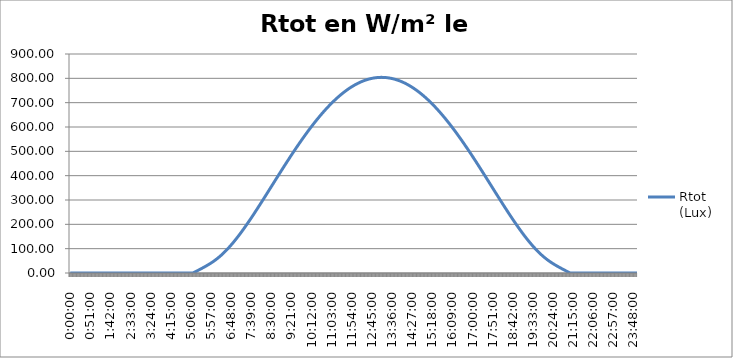
| Category | Rtot
(Lux) |
|---|---|
| 0.0 | 0 |
| 0.0006944444444444445 | 0 |
| 0.001388888888888889 | 0 |
| 0.0020833333333333333 | 0 |
| 0.002777777777777778 | 0 |
| 0.0034722222222222225 | 0 |
| 0.004166666666666667 | 0 |
| 0.004861111111111111 | 0 |
| 0.005555555555555556 | 0 |
| 0.00625 | 0 |
| 0.006944444444444445 | 0 |
| 0.0076388888888888895 | 0 |
| 0.008333333333333333 | 0 |
| 0.009027777777777777 | 0 |
| 0.00972222222222222 | 0 |
| 0.010416666666666664 | 0 |
| 0.011111111111111108 | 0 |
| 0.011805555555555552 | 0 |
| 0.012499999999999995 | 0 |
| 0.01319444444444444 | 0 |
| 0.013888888888888883 | 0 |
| 0.014583333333333327 | 0 |
| 0.01527777777777777 | 0 |
| 0.015972222222222214 | 0 |
| 0.01666666666666666 | 0 |
| 0.017361111111111105 | 0 |
| 0.01805555555555555 | 0 |
| 0.018749999999999996 | 0 |
| 0.01944444444444444 | 0 |
| 0.020138888888888887 | 0 |
| 0.020833333333333332 | 0 |
| 0.021527777777777778 | 0 |
| 0.022222222222222223 | 0 |
| 0.02291666666666667 | 0 |
| 0.023611111111111114 | 0 |
| 0.02430555555555556 | 0 |
| 0.025000000000000005 | 0 |
| 0.02569444444444445 | 0 |
| 0.026388888888888896 | 0 |
| 0.02708333333333334 | 0 |
| 0.027777777777777787 | 0 |
| 0.028472222222222232 | 0 |
| 0.029166666666666678 | 0 |
| 0.029861111111111123 | 0 |
| 0.03055555555555557 | 0 |
| 0.031250000000000014 | 0 |
| 0.031944444444444456 | 0 |
| 0.0326388888888889 | 0 |
| 0.03333333333333334 | 0 |
| 0.03402777777777778 | 0 |
| 0.034722222222222224 | 0 |
| 0.035416666666666666 | 0 |
| 0.03611111111111111 | 0 |
| 0.03680555555555555 | 0 |
| 0.03749999999999999 | 0 |
| 0.038194444444444434 | 0 |
| 0.038888888888888876 | 0 |
| 0.03958333333333332 | 0 |
| 0.04027777777777776 | 0 |
| 0.0409722222222222 | 0 |
| 0.041666666666666644 | 0 |
| 0.042361111111111086 | 0 |
| 0.04305555555555553 | 0 |
| 0.04374999999999997 | 0 |
| 0.04444444444444441 | 0 |
| 0.04513888888888885 | 0 |
| 0.045833333333333295 | 0 |
| 0.04652777777777774 | 0 |
| 0.04722222222222218 | 0 |
| 0.04791666666666662 | 0 |
| 0.04861111111111106 | 0 |
| 0.049305555555555505 | 0 |
| 0.04999999999999995 | 0 |
| 0.05069444444444439 | 0 |
| 0.05138888888888883 | 0 |
| 0.05208333333333327 | 0 |
| 0.052777777777777715 | 0 |
| 0.05347222222222216 | 0 |
| 0.0541666666666666 | 0 |
| 0.05486111111111104 | 0 |
| 0.05555555555555548 | 0 |
| 0.056249999999999925 | 0 |
| 0.05694444444444437 | 0 |
| 0.05763888888888881 | 0 |
| 0.05833333333333325 | 0 |
| 0.05902777777777769 | 0 |
| 0.059722222222222135 | 0 |
| 0.06041666666666658 | 0 |
| 0.06111111111111102 | 0 |
| 0.06180555555555546 | 0 |
| 0.0624999999999999 | 0 |
| 0.06319444444444434 | 0 |
| 0.06388888888888879 | 0 |
| 0.06458333333333323 | 0 |
| 0.06527777777777767 | 0 |
| 0.06597222222222211 | 0 |
| 0.06666666666666655 | 0 |
| 0.067361111111111 | 0 |
| 0.06805555555555544 | 0 |
| 0.06874999999999988 | 0 |
| 0.06944444444444432 | 0 |
| 0.07013888888888876 | 0 |
| 0.0708333333333332 | 0 |
| 0.07152777777777765 | 0 |
| 0.07222222222222209 | 0 |
| 0.07291666666666653 | 0 |
| 0.07361111111111097 | 0 |
| 0.07430555555555542 | 0 |
| 0.07499999999999986 | 0 |
| 0.0756944444444443 | 0 |
| 0.07638888888888874 | 0 |
| 0.07708333333333318 | 0 |
| 0.07777777777777763 | 0 |
| 0.07847222222222207 | 0 |
| 0.07916666666666651 | 0 |
| 0.07986111111111095 | 0 |
| 0.0805555555555554 | 0 |
| 0.08124999999999984 | 0 |
| 0.08194444444444428 | 0 |
| 0.08263888888888872 | 0 |
| 0.08333333333333316 | 0 |
| 0.0840277777777776 | 0 |
| 0.08472222222222205 | 0 |
| 0.08541666666666649 | 0 |
| 0.08611111111111093 | 0 |
| 0.08680555555555537 | 0 |
| 0.08749999999999981 | 0 |
| 0.08819444444444426 | 0 |
| 0.0888888888888887 | 0 |
| 0.08958333333333314 | 0 |
| 0.09027777777777758 | 0 |
| 0.09097222222222202 | 0 |
| 0.09166666666666647 | 0 |
| 0.09236111111111091 | 0 |
| 0.09305555555555535 | 0 |
| 0.09374999999999979 | 0 |
| 0.09444444444444423 | 0 |
| 0.09513888888888868 | 0 |
| 0.09583333333333312 | 0 |
| 0.09652777777777756 | 0 |
| 0.097222222222222 | 0 |
| 0.09791666666666644 | 0 |
| 0.09861111111111089 | 0 |
| 0.09930555555555533 | 0 |
| 0.09999999999999977 | 0 |
| 0.10069444444444421 | 0 |
| 0.10138888888888865 | 0 |
| 0.1020833333333331 | 0 |
| 0.10277777777777754 | 0 |
| 0.10347222222222198 | 0 |
| 0.10416666666666642 | 0 |
| 0.10486111111111086 | 0 |
| 0.1055555555555553 | 0 |
| 0.10624999999999975 | 0 |
| 0.10694444444444419 | 0 |
| 0.10763888888888863 | 0 |
| 0.10833333333333307 | 0 |
| 0.10902777777777752 | 0 |
| 0.10972222222222196 | 0 |
| 0.1104166666666664 | 0 |
| 0.11111111111111084 | 0 |
| 0.11180555555555528 | 0 |
| 0.11249999999999973 | 0 |
| 0.11319444444444417 | 0 |
| 0.11388888888888861 | 0 |
| 0.11458333333333305 | 0 |
| 0.1152777777777775 | 0 |
| 0.11597222222222194 | 0 |
| 0.11666666666666638 | 0 |
| 0.11736111111111082 | 0 |
| 0.11805555555555526 | 0 |
| 0.1187499999999997 | 0 |
| 0.11944444444444414 | 0 |
| 0.12013888888888859 | 0 |
| 0.12083333333333303 | 0 |
| 0.12152777777777747 | 0 |
| 0.12222222222222191 | 0 |
| 0.12291666666666635 | 0 |
| 0.1236111111111108 | 0 |
| 0.12430555555555524 | 0 |
| 0.12499999999999968 | 0 |
| 0.12569444444444414 | 0 |
| 0.12638888888888858 | 0 |
| 0.12708333333333302 | 0 |
| 0.12777777777777746 | 0 |
| 0.1284722222222219 | 0 |
| 0.12916666666666635 | 0 |
| 0.1298611111111108 | 0 |
| 0.13055555555555523 | 0 |
| 0.13124999999999967 | 0 |
| 0.13194444444444411 | 0 |
| 0.13263888888888856 | 0 |
| 0.133333333333333 | 0 |
| 0.13402777777777744 | 0 |
| 0.13472222222222188 | 0 |
| 0.13541666666666632 | 0 |
| 0.13611111111111077 | 0 |
| 0.1368055555555552 | 0 |
| 0.13749999999999965 | 0 |
| 0.1381944444444441 | 0 |
| 0.13888888888888853 | 0 |
| 0.13958333333333298 | 0 |
| 0.14027777777777742 | 0 |
| 0.14097222222222186 | 0 |
| 0.1416666666666663 | 0 |
| 0.14236111111111074 | 0 |
| 0.14305555555555519 | 0 |
| 0.14374999999999963 | 0 |
| 0.14444444444444407 | 0 |
| 0.1451388888888885 | 0 |
| 0.14583333333333295 | 0 |
| 0.1465277777777774 | 0 |
| 0.14722222222222184 | 0 |
| 0.14791666666666628 | 0 |
| 0.14861111111111072 | 0 |
| 0.14930555555555516 | 0 |
| 0.1499999999999996 | 0 |
| 0.15069444444444405 | 0 |
| 0.1513888888888885 | 0 |
| 0.15208333333333293 | 0 |
| 0.15277777777777737 | 0 |
| 0.15347222222222182 | 0 |
| 0.15416666666666626 | 0 |
| 0.1548611111111107 | 0 |
| 0.15555555555555514 | 0 |
| 0.15624999999999958 | 0 |
| 0.15694444444444403 | 0 |
| 0.15763888888888847 | 0 |
| 0.1583333333333329 | 0 |
| 0.15902777777777735 | 0 |
| 0.1597222222222218 | 0 |
| 0.16041666666666624 | 0 |
| 0.16111111111111068 | 0 |
| 0.16180555555555512 | 0 |
| 0.16249999999999956 | 0 |
| 0.163194444444444 | 0 |
| 0.16388888888888845 | 0 |
| 0.1645833333333329 | 0 |
| 0.16527777777777733 | 0 |
| 0.16597222222222177 | 0 |
| 0.1666666666666662 | 0 |
| 0.16736111111111066 | 0 |
| 0.1680555555555551 | 0 |
| 0.16874999999999954 | 0 |
| 0.16944444444444398 | 0 |
| 0.17013888888888842 | 0 |
| 0.17083333333333287 | 0 |
| 0.1715277777777773 | 0 |
| 0.17222222222222175 | 0 |
| 0.1729166666666662 | 0 |
| 0.17361111111111063 | 0 |
| 0.17430555555555508 | 0 |
| 0.17499999999999952 | 0 |
| 0.17569444444444396 | 0 |
| 0.1763888888888884 | 0 |
| 0.17708333333333284 | 0 |
| 0.17777777777777728 | 0 |
| 0.17847222222222173 | 0 |
| 0.17916666666666617 | 0 |
| 0.1798611111111106 | 0 |
| 0.18055555555555505 | 0 |
| 0.1812499999999995 | 0 |
| 0.18194444444444394 | 0 |
| 0.18263888888888838 | 0 |
| 0.18333333333333282 | 0 |
| 0.18402777777777726 | 0 |
| 0.1847222222222217 | 0 |
| 0.18541666666666615 | 0 |
| 0.1861111111111106 | 0 |
| 0.18680555555555503 | 0 |
| 0.18749999999999947 | 0 |
| 0.18819444444444391 | 0 |
| 0.18888888888888836 | 0 |
| 0.1895833333333328 | 0 |
| 0.19027777777777724 | 0 |
| 0.19097222222222168 | 0 |
| 0.19166666666666612 | 0 |
| 0.19236111111111057 | 0 |
| 0.193055555555555 | 0 |
| 0.19374999999999945 | 0 |
| 0.1944444444444439 | 0 |
| 0.19513888888888833 | 0 |
| 0.19583333333333278 | 0 |
| 0.19652777777777722 | 0 |
| 0.19722222222222166 | 0 |
| 0.1979166666666661 | 0 |
| 0.19861111111111054 | 0 |
| 0.199305555555555 | 0 |
| 0.19999999999999943 | 0 |
| 0.20069444444444387 | 0 |
| 0.2013888888888883 | 0 |
| 0.20208333333333275 | 0 |
| 0.2027777777777772 | 0 |
| 0.20347222222222164 | 0 |
| 0.20416666666666608 | 0 |
| 0.20486111111111052 | 0 |
| 0.20555555555555496 | 0 |
| 0.2062499999999994 | 0 |
| 0.20694444444444385 | 0 |
| 0.2076388888888883 | 0 |
| 0.20833333333333273 | 0 |
| 0.20902777777777717 | 0 |
| 0.20972222222222162 | 0 |
| 0.21041666666666606 | 0 |
| 0.2111111111111105 | 0 |
| 0.21180555555555494 | 0 |
| 0.21249999999999938 | 0 |
| 0.21319444444444383 | 0 |
| 0.21388888888888827 | 0 |
| 0.2145833333333327 | 0 |
| 0.21527777777777715 | 0 |
| 0.2159722222222216 | 0 |
| 0.21666666666666604 | 0.661 |
| 0.21736111111111048 | 1.487 |
| 0.21805555555555492 | 2.316 |
| 0.21874999999999936 | 3.146 |
| 0.2194444444444438 | 3.979 |
| 0.22013888888888825 | 4.813 |
| 0.2208333333333327 | 5.65 |
| 0.22152777777777713 | 6.488 |
| 0.22222222222222157 | 7.328 |
| 0.222916666666666 | 8.171 |
| 0.22361111111111046 | 9.015 |
| 0.2243055555555549 | 9.861 |
| 0.22499999999999934 | 10.709 |
| 0.22569444444444378 | 11.559 |
| 0.22638888888888822 | 12.411 |
| 0.22708333333333267 | 13.265 |
| 0.2277777777777771 | 14.121 |
| 0.22847222222222155 | 14.979 |
| 0.229166666666666 | 15.839 |
| 0.22986111111111043 | 16.702 |
| 0.23055555555555488 | 17.567 |
| 0.23124999999999932 | 18.435 |
| 0.23194444444444376 | 19.306 |
| 0.2326388888888882 | 20.18 |
| 0.23333333333333264 | 21.058 |
| 0.23402777777777709 | 21.939 |
| 0.23472222222222153 | 22.824 |
| 0.23541666666666597 | 23.714 |
| 0.2361111111111104 | 24.608 |
| 0.23680555555555485 | 25.507 |
| 0.2374999999999993 | 26.412 |
| 0.23819444444444374 | 27.323 |
| 0.23888888888888818 | 28.24 |
| 0.23958333333333262 | 29.164 |
| 0.24027777777777706 | 30.095 |
| 0.2409722222222215 | 31.034 |
| 0.24166666666666595 | 31.981 |
| 0.2423611111111104 | 32.936 |
| 0.24305555555555483 | 33.901 |
| 0.24374999999999927 | 34.876 |
| 0.24444444444444371 | 35.86 |
| 0.24513888888888816 | 36.855 |
| 0.2458333333333326 | 37.861 |
| 0.24652777777777704 | 38.878 |
| 0.24722222222222148 | 39.907 |
| 0.24791666666666592 | 40.949 |
| 0.24861111111111037 | 42.003 |
| 0.2493055555555548 | 43.07 |
| 0.24999999999999925 | 44.15 |
| 0.2506944444444437 | 45.244 |
| 0.25138888888888816 | 46.353 |
| 0.2520833333333326 | 47.475 |
| 0.25277777777777705 | 48.612 |
| 0.2534722222222215 | 49.765 |
| 0.25416666666666593 | 50.932 |
| 0.25486111111111037 | 52.115 |
| 0.2555555555555548 | 53.314 |
| 0.25624999999999926 | 54.529 |
| 0.2569444444444437 | 55.759 |
| 0.25763888888888814 | 57.006 |
| 0.2583333333333326 | 58.27 |
| 0.259027777777777 | 59.55 |
| 0.25972222222222147 | 60.847 |
| 0.2604166666666659 | 62.161 |
| 0.26111111111111035 | 63.492 |
| 0.2618055555555548 | 64.84 |
| 0.26249999999999923 | 66.205 |
| 0.2631944444444437 | 67.587 |
| 0.2638888888888881 | 68.986 |
| 0.26458333333333256 | 70.403 |
| 0.265277777777777 | 71.837 |
| 0.26597222222222144 | 73.288 |
| 0.2666666666666659 | 74.757 |
| 0.26736111111111033 | 76.243 |
| 0.26805555555555477 | 77.746 |
| 0.2687499999999992 | 79.266 |
| 0.26944444444444365 | 80.804 |
| 0.2701388888888881 | 82.359 |
| 0.27083333333333254 | 83.931 |
| 0.271527777777777 | 85.52 |
| 0.2722222222222214 | 87.126 |
| 0.27291666666666586 | 88.749 |
| 0.2736111111111103 | 90.388 |
| 0.27430555555555475 | 92.045 |
| 0.2749999999999992 | 93.718 |
| 0.27569444444444363 | 95.407 |
| 0.2763888888888881 | 97.113 |
| 0.2770833333333325 | 98.836 |
| 0.27777777777777696 | 100.574 |
| 0.2784722222222214 | 102.329 |
| 0.27916666666666584 | 104.099 |
| 0.2798611111111103 | 105.885 |
| 0.2805555555555547 | 107.687 |
| 0.28124999999999917 | 109.505 |
| 0.2819444444444436 | 111.338 |
| 0.28263888888888805 | 113.186 |
| 0.2833333333333325 | 115.049 |
| 0.28402777777777694 | 116.927 |
| 0.2847222222222214 | 118.82 |
| 0.2854166666666658 | 120.728 |
| 0.28611111111111026 | 122.65 |
| 0.2868055555555547 | 124.587 |
| 0.28749999999999915 | 126.537 |
| 0.2881944444444436 | 128.502 |
| 0.28888888888888803 | 130.481 |
| 0.28958333333333247 | 132.473 |
| 0.2902777777777769 | 134.479 |
| 0.29097222222222136 | 136.498 |
| 0.2916666666666658 | 138.53 |
| 0.29236111111111024 | 140.576 |
| 0.2930555555555547 | 142.634 |
| 0.2937499999999991 | 144.705 |
| 0.29444444444444356 | 146.789 |
| 0.295138888888888 | 148.884 |
| 0.29583333333333245 | 150.993 |
| 0.2965277777777769 | 153.113 |
| 0.29722222222222133 | 155.245 |
| 0.2979166666666658 | 157.388 |
| 0.2986111111111102 | 159.543 |
| 0.29930555555555466 | 161.71 |
| 0.2999999999999991 | 163.888 |
| 0.30069444444444354 | 166.077 |
| 0.301388888888888 | 168.276 |
| 0.3020833333333324 | 170.486 |
| 0.30277777777777687 | 172.707 |
| 0.3034722222222213 | 174.938 |
| 0.30416666666666575 | 177.18 |
| 0.3048611111111102 | 179.431 |
| 0.30555555555555464 | 181.692 |
| 0.3062499999999991 | 183.963 |
| 0.3069444444444435 | 186.244 |
| 0.30763888888888796 | 188.533 |
| 0.3083333333333324 | 190.832 |
| 0.30902777777777685 | 193.14 |
| 0.3097222222222213 | 195.457 |
| 0.31041666666666573 | 197.783 |
| 0.3111111111111102 | 200.117 |
| 0.3118055555555546 | 202.459 |
| 0.31249999999999906 | 204.81 |
| 0.3131944444444435 | 207.169 |
| 0.31388888888888794 | 209.535 |
| 0.3145833333333324 | 211.91 |
| 0.3152777777777768 | 214.292 |
| 0.31597222222222127 | 216.681 |
| 0.3166666666666657 | 219.078 |
| 0.31736111111111015 | 221.482 |
| 0.3180555555555546 | 223.893 |
| 0.31874999999999903 | 226.31 |
| 0.3194444444444435 | 228.735 |
| 0.3201388888888879 | 231.166 |
| 0.32083333333333236 | 233.603 |
| 0.3215277777777768 | 236.046 |
| 0.32222222222222124 | 238.496 |
| 0.3229166666666657 | 240.951 |
| 0.32361111111111013 | 243.413 |
| 0.32430555555555457 | 245.88 |
| 0.324999999999999 | 248.352 |
| 0.32569444444444345 | 250.83 |
| 0.3263888888888879 | 253.313 |
| 0.32708333333333234 | 255.801 |
| 0.3277777777777768 | 258.294 |
| 0.3284722222222212 | 260.792 |
| 0.32916666666666566 | 263.294 |
| 0.3298611111111101 | 265.801 |
| 0.33055555555555455 | 268.312 |
| 0.331249999999999 | 270.828 |
| 0.33194444444444343 | 273.347 |
| 0.3326388888888879 | 275.871 |
| 0.3333333333333323 | 278.398 |
| 0.33402777777777676 | 280.93 |
| 0.3347222222222212 | 283.464 |
| 0.33541666666666564 | 286.002 |
| 0.3361111111111101 | 288.544 |
| 0.3368055555555545 | 291.088 |
| 0.33749999999999897 | 293.636 |
| 0.3381944444444434 | 296.187 |
| 0.33888888888888785 | 298.74 |
| 0.3395833333333323 | 301.296 |
| 0.34027777777777674 | 303.855 |
| 0.3409722222222212 | 306.416 |
| 0.3416666666666656 | 308.979 |
| 0.34236111111111006 | 311.544 |
| 0.3430555555555545 | 314.112 |
| 0.34374999999999895 | 316.681 |
| 0.3444444444444434 | 319.252 |
| 0.34513888888888783 | 321.825 |
| 0.34583333333333227 | 324.4 |
| 0.3465277777777767 | 326.976 |
| 0.34722222222222116 | 329.553 |
| 0.3479166666666656 | 332.131 |
| 0.34861111111111004 | 334.711 |
| 0.3493055555555545 | 337.291 |
| 0.3499999999999989 | 339.872 |
| 0.35069444444444337 | 342.454 |
| 0.3513888888888878 | 345.037 |
| 0.35208333333333225 | 347.62 |
| 0.3527777777777767 | 350.204 |
| 0.35347222222222113 | 352.787 |
| 0.3541666666666656 | 355.371 |
| 0.35486111111111 | 357.955 |
| 0.35555555555555446 | 360.54 |
| 0.3562499999999989 | 363.123 |
| 0.35694444444444334 | 365.707 |
| 0.3576388888888878 | 368.29 |
| 0.3583333333333322 | 370.873 |
| 0.35902777777777667 | 373.455 |
| 0.3597222222222211 | 376.037 |
| 0.36041666666666555 | 378.617 |
| 0.36111111111111 | 381.197 |
| 0.36180555555555444 | 383.776 |
| 0.3624999999999989 | 386.354 |
| 0.3631944444444433 | 388.93 |
| 0.36388888888888776 | 391.505 |
| 0.3645833333333322 | 394.079 |
| 0.36527777777777665 | 396.651 |
| 0.3659722222222211 | 399.222 |
| 0.36666666666666553 | 401.791 |
| 0.36736111111111 | 404.358 |
| 0.3680555555555544 | 406.923 |
| 0.36874999999999886 | 409.486 |
| 0.3694444444444433 | 412.047 |
| 0.37013888888888774 | 414.606 |
| 0.3708333333333322 | 417.162 |
| 0.3715277777777766 | 419.717 |
| 0.37222222222222107 | 422.268 |
| 0.3729166666666655 | 424.817 |
| 0.37361111111110995 | 427.364 |
| 0.3743055555555544 | 429.907 |
| 0.37499999999999883 | 432.448 |
| 0.3756944444444433 | 434.986 |
| 0.3763888888888877 | 437.52 |
| 0.37708333333333216 | 440.052 |
| 0.3777777777777766 | 442.58 |
| 0.37847222222222104 | 445.105 |
| 0.3791666666666655 | 447.627 |
| 0.37986111111110993 | 450.145 |
| 0.38055555555555437 | 452.66 |
| 0.3812499999999988 | 455.17 |
| 0.38194444444444325 | 457.677 |
| 0.3826388888888877 | 460.181 |
| 0.38333333333333214 | 462.68 |
| 0.3840277777777766 | 465.175 |
| 0.384722222222221 | 467.666 |
| 0.38541666666666546 | 470.153 |
| 0.3861111111111099 | 472.636 |
| 0.38680555555555435 | 475.114 |
| 0.3874999999999988 | 477.588 |
| 0.38819444444444323 | 480.057 |
| 0.3888888888888877 | 482.522 |
| 0.3895833333333321 | 484.981 |
| 0.39027777777777656 | 487.437 |
| 0.390972222222221 | 489.887 |
| 0.39166666666666544 | 492.332 |
| 0.3923611111111099 | 494.773 |
| 0.3930555555555543 | 497.208 |
| 0.39374999999999877 | 499.638 |
| 0.3944444444444432 | 502.062 |
| 0.39513888888888765 | 504.482 |
| 0.3958333333333321 | 506.896 |
| 0.39652777777777654 | 509.304 |
| 0.397222222222221 | 511.707 |
| 0.3979166666666654 | 514.104 |
| 0.39861111111110986 | 516.496 |
| 0.3993055555555543 | 518.882 |
| 0.39999999999999875 | 521.261 |
| 0.4006944444444432 | 523.635 |
| 0.40138888888888763 | 526.003 |
| 0.40208333333333207 | 528.365 |
| 0.4027777777777765 | 530.72 |
| 0.40347222222222096 | 533.07 |
| 0.4041666666666654 | 535.413 |
| 0.40486111111110984 | 537.749 |
| 0.4055555555555543 | 540.079 |
| 0.4062499999999987 | 542.403 |
| 0.40694444444444317 | 544.72 |
| 0.4076388888888876 | 547.03 |
| 0.40833333333333205 | 549.333 |
| 0.4090277777777765 | 551.63 |
| 0.40972222222222093 | 553.92 |
| 0.4104166666666654 | 556.202 |
| 0.4111111111111098 | 558.478 |
| 0.41180555555555426 | 560.747 |
| 0.4124999999999987 | 563.008 |
| 0.41319444444444314 | 565.262 |
| 0.4138888888888876 | 567.509 |
| 0.414583333333332 | 569.749 |
| 0.41527777777777647 | 571.981 |
| 0.4159722222222209 | 574.206 |
| 0.41666666666666535 | 576.423 |
| 0.4173611111111098 | 578.632 |
| 0.41805555555555424 | 580.834 |
| 0.4187499999999987 | 583.027 |
| 0.4194444444444431 | 585.213 |
| 0.42013888888888756 | 587.392 |
| 0.420833333333332 | 589.562 |
| 0.42152777777777645 | 591.724 |
| 0.4222222222222209 | 593.878 |
| 0.42291666666666533 | 596.024 |
| 0.4236111111111098 | 598.162 |
| 0.4243055555555542 | 600.291 |
| 0.42499999999999866 | 602.412 |
| 0.4256944444444431 | 604.525 |
| 0.42638888888888754 | 606.629 |
| 0.427083333333332 | 608.725 |
| 0.4277777777777764 | 610.812 |
| 0.42847222222222087 | 612.891 |
| 0.4291666666666653 | 614.96 |
| 0.42986111111110975 | 617.022 |
| 0.4305555555555542 | 619.074 |
| 0.43124999999999863 | 621.117 |
| 0.4319444444444431 | 623.152 |
| 0.4326388888888875 | 625.177 |
| 0.43333333333333196 | 627.194 |
| 0.4340277777777764 | 629.201 |
| 0.43472222222222084 | 631.199 |
| 0.4354166666666653 | 633.188 |
| 0.43611111111110973 | 635.168 |
| 0.43680555555555417 | 637.138 |
| 0.4374999999999986 | 639.099 |
| 0.43819444444444305 | 641.051 |
| 0.4388888888888875 | 642.993 |
| 0.43958333333333194 | 644.926 |
| 0.4402777777777764 | 646.849 |
| 0.4409722222222208 | 648.762 |
| 0.44166666666666526 | 650.666 |
| 0.4423611111111097 | 652.56 |
| 0.44305555555555415 | 654.444 |
| 0.4437499999999986 | 656.318 |
| 0.44444444444444303 | 658.182 |
| 0.4451388888888875 | 660.037 |
| 0.4458333333333319 | 661.881 |
| 0.44652777777777636 | 663.716 |
| 0.4472222222222208 | 665.54 |
| 0.44791666666666524 | 667.354 |
| 0.4486111111111097 | 669.158 |
| 0.4493055555555541 | 670.952 |
| 0.44999999999999857 | 672.735 |
| 0.450694444444443 | 674.508 |
| 0.45138888888888745 | 676.271 |
| 0.4520833333333319 | 678.023 |
| 0.45277777777777634 | 679.765 |
| 0.4534722222222208 | 681.496 |
| 0.4541666666666652 | 683.217 |
| 0.45486111111110966 | 684.927 |
| 0.4555555555555541 | 686.626 |
| 0.45624999999999855 | 688.315 |
| 0.456944444444443 | 689.992 |
| 0.45763888888888743 | 691.659 |
| 0.45833333333333187 | 693.316 |
| 0.4590277777777763 | 694.961 |
| 0.45972222222222076 | 696.595 |
| 0.4604166666666652 | 698.219 |
| 0.46111111111110964 | 699.831 |
| 0.4618055555555541 | 701.433 |
| 0.4624999999999985 | 703.023 |
| 0.46319444444444297 | 704.602 |
| 0.4638888888888874 | 706.17 |
| 0.46458333333333185 | 707.726 |
| 0.4652777777777763 | 709.272 |
| 0.46597222222222073 | 710.806 |
| 0.4666666666666652 | 712.329 |
| 0.4673611111111096 | 713.84 |
| 0.46805555555555406 | 715.34 |
| 0.4687499999999985 | 716.828 |
| 0.46944444444444294 | 718.305 |
| 0.4701388888888874 | 719.771 |
| 0.4708333333333318 | 721.224 |
| 0.47152777777777627 | 722.667 |
| 0.4722222222222207 | 724.097 |
| 0.47291666666666515 | 725.516 |
| 0.4736111111111096 | 726.923 |
| 0.47430555555555404 | 728.318 |
| 0.4749999999999985 | 729.702 |
| 0.4756944444444429 | 731.074 |
| 0.47638888888888736 | 732.433 |
| 0.4770833333333318 | 733.781 |
| 0.47777777777777625 | 735.117 |
| 0.4784722222222207 | 736.441 |
| 0.47916666666666513 | 737.753 |
| 0.4798611111111096 | 739.053 |
| 0.480555555555554 | 740.341 |
| 0.48124999999999846 | 741.617 |
| 0.4819444444444429 | 742.88 |
| 0.48263888888888734 | 744.132 |
| 0.4833333333333318 | 745.371 |
| 0.4840277777777762 | 746.598 |
| 0.48472222222222067 | 747.813 |
| 0.4854166666666651 | 749.015 |
| 0.48611111111110955 | 750.205 |
| 0.486805555555554 | 751.383 |
| 0.48749999999999843 | 752.548 |
| 0.4881944444444429 | 753.701 |
| 0.4888888888888873 | 754.842 |
| 0.48958333333333176 | 755.97 |
| 0.4902777777777762 | 757.085 |
| 0.49097222222222064 | 758.188 |
| 0.4916666666666651 | 759.278 |
| 0.49236111111110953 | 760.356 |
| 0.49305555555555397 | 761.421 |
| 0.4937499999999984 | 762.474 |
| 0.49444444444444285 | 763.514 |
| 0.4951388888888873 | 764.541 |
| 0.49583333333333174 | 765.555 |
| 0.4965277777777762 | 766.557 |
| 0.4972222222222206 | 767.546 |
| 0.49791666666666506 | 768.522 |
| 0.4986111111111095 | 769.485 |
| 0.49930555555555395 | 770.436 |
| 0.4999999999999984 | 771.373 |
| 0.5006944444444429 | 772.298 |
| 0.5013888888888873 | 773.21 |
| 0.5020833333333318 | 774.108 |
| 0.5027777777777762 | 774.994 |
| 0.5034722222222207 | 775.867 |
| 0.5041666666666651 | 776.727 |
| 0.5048611111111095 | 777.574 |
| 0.505555555555554 | 778.408 |
| 0.5062499999999984 | 779.228 |
| 0.5069444444444429 | 780.036 |
| 0.5076388888888873 | 780.83 |
| 0.5083333333333317 | 781.612 |
| 0.5090277777777762 | 782.38 |
| 0.5097222222222206 | 783.135 |
| 0.5104166666666651 | 783.877 |
| 0.5111111111111095 | 784.606 |
| 0.511805555555554 | 785.321 |
| 0.5124999999999984 | 786.023 |
| 0.5131944444444428 | 786.712 |
| 0.5138888888888873 | 787.388 |
| 0.5145833333333317 | 788.05 |
| 0.5152777777777762 | 788.699 |
| 0.5159722222222206 | 789.335 |
| 0.516666666666665 | 789.958 |
| 0.5173611111111095 | 790.567 |
| 0.5180555555555539 | 791.162 |
| 0.5187499999999984 | 791.745 |
| 0.5194444444444428 | 792.313 |
| 0.5201388888888873 | 792.869 |
| 0.5208333333333317 | 793.411 |
| 0.5215277777777761 | 793.94 |
| 0.5222222222222206 | 794.455 |
| 0.522916666666665 | 794.956 |
| 0.5236111111111095 | 795.445 |
| 0.5243055555555539 | 795.919 |
| 0.5249999999999984 | 796.381 |
| 0.5256944444444428 | 796.828 |
| 0.5263888888888872 | 797.262 |
| 0.5270833333333317 | 797.683 |
| 0.5277777777777761 | 798.09 |
| 0.5284722222222206 | 798.484 |
| 0.529166666666665 | 798.864 |
| 0.5298611111111095 | 799.23 |
| 0.5305555555555539 | 799.583 |
| 0.5312499999999983 | 799.922 |
| 0.5319444444444428 | 800.248 |
| 0.5326388888888872 | 800.56 |
| 0.5333333333333317 | 800.858 |
| 0.5340277777777761 | 801.143 |
| 0.5347222222222205 | 801.414 |
| 0.535416666666665 | 801.671 |
| 0.5361111111111094 | 801.915 |
| 0.5368055555555539 | 802.145 |
| 0.5374999999999983 | 802.362 |
| 0.5381944444444428 | 802.565 |
| 0.5388888888888872 | 802.754 |
| 0.5395833333333316 | 802.929 |
| 0.5402777777777761 | 803.091 |
| 0.5409722222222205 | 803.24 |
| 0.541666666666665 | 803.374 |
| 0.5423611111111094 | 803.495 |
| 0.5430555555555538 | 803.602 |
| 0.5437499999999983 | 803.695 |
| 0.5444444444444427 | 803.775 |
| 0.5451388888888872 | 803.841 |
| 0.5458333333333316 | 803.893 |
| 0.5465277777777761 | 803.932 |
| 0.5472222222222205 | 803.957 |
| 0.5479166666666649 | 803.968 |
| 0.5486111111111094 | 803.966 |
| 0.5493055555555538 | 803.95 |
| 0.5499999999999983 | 803.92 |
| 0.5506944444444427 | 803.876 |
| 0.5513888888888872 | 803.819 |
| 0.5520833333333316 | 803.748 |
| 0.552777777777776 | 803.663 |
| 0.5534722222222205 | 803.565 |
| 0.5541666666666649 | 803.453 |
| 0.5548611111111094 | 803.327 |
| 0.5555555555555538 | 803.188 |
| 0.5562499999999982 | 803.035 |
| 0.5569444444444427 | 802.868 |
| 0.5576388888888871 | 802.687 |
| 0.5583333333333316 | 802.493 |
| 0.559027777777776 | 802.286 |
| 0.5597222222222205 | 802.064 |
| 0.5604166666666649 | 801.829 |
| 0.5611111111111093 | 801.58 |
| 0.5618055555555538 | 801.318 |
| 0.5624999999999982 | 801.042 |
| 0.5631944444444427 | 800.752 |
| 0.5638888888888871 | 800.449 |
| 0.5645833333333315 | 800.132 |
| 0.565277777777776 | 799.801 |
| 0.5659722222222204 | 799.457 |
| 0.5666666666666649 | 799.1 |
| 0.5673611111111093 | 798.728 |
| 0.5680555555555538 | 798.344 |
| 0.5687499999999982 | 797.945 |
| 0.5694444444444426 | 797.533 |
| 0.5701388888888871 | 797.108 |
| 0.5708333333333315 | 796.669 |
| 0.571527777777776 | 796.216 |
| 0.5722222222222204 | 795.75 |
| 0.5729166666666649 | 795.27 |
| 0.5736111111111093 | 794.777 |
| 0.5743055555555537 | 794.271 |
| 0.5749999999999982 | 793.751 |
| 0.5756944444444426 | 793.217 |
| 0.5763888888888871 | 792.67 |
| 0.5770833333333315 | 792.11 |
| 0.577777777777776 | 791.536 |
| 0.5784722222222204 | 790.949 |
| 0.5791666666666648 | 790.349 |
| 0.5798611111111093 | 789.735 |
| 0.5805555555555537 | 789.108 |
| 0.5812499999999982 | 788.467 |
| 0.5819444444444426 | 787.813 |
| 0.582638888888887 | 787.146 |
| 0.5833333333333315 | 786.466 |
| 0.5840277777777759 | 785.772 |
| 0.5847222222222204 | 785.065 |
| 0.5854166666666648 | 784.345 |
| 0.5861111111111093 | 783.611 |
| 0.5868055555555537 | 782.865 |
| 0.5874999999999981 | 782.105 |
| 0.5881944444444426 | 781.332 |
| 0.588888888888887 | 780.546 |
| 0.5895833333333315 | 779.747 |
| 0.5902777777777759 | 778.934 |
| 0.5909722222222203 | 778.109 |
| 0.5916666666666648 | 777.27 |
| 0.5923611111111092 | 776.419 |
| 0.5930555555555537 | 775.554 |
| 0.5937499999999981 | 774.677 |
| 0.5944444444444426 | 773.786 |
| 0.595138888888887 | 772.883 |
| 0.5958333333333314 | 771.966 |
| 0.5965277777777759 | 771.037 |
| 0.5972222222222203 | 770.095 |
| 0.5979166666666648 | 769.14 |
| 0.5986111111111092 | 768.172 |
| 0.5993055555555536 | 767.191 |
| 0.5999999999999981 | 766.198 |
| 0.6006944444444425 | 765.192 |
| 0.601388888888887 | 764.172 |
| 0.6020833333333314 | 763.141 |
| 0.6027777777777759 | 762.096 |
| 0.6034722222222203 | 761.039 |
| 0.6041666666666647 | 759.97 |
| 0.6048611111111092 | 758.887 |
| 0.6055555555555536 | 757.792 |
| 0.6062499999999981 | 756.685 |
| 0.6069444444444425 | 755.565 |
| 0.607638888888887 | 754.432 |
| 0.6083333333333314 | 753.288 |
| 0.6090277777777758 | 752.13 |
| 0.6097222222222203 | 750.96 |
| 0.6104166666666647 | 749.778 |
| 0.6111111111111092 | 748.584 |
| 0.6118055555555536 | 747.377 |
| 0.612499999999998 | 746.158 |
| 0.6131944444444425 | 744.926 |
| 0.6138888888888869 | 743.683 |
| 0.6145833333333314 | 742.427 |
| 0.6152777777777758 | 741.159 |
| 0.6159722222222203 | 739.879 |
| 0.6166666666666647 | 738.587 |
| 0.6173611111111091 | 737.282 |
| 0.6180555555555536 | 735.966 |
| 0.618749999999998 | 734.638 |
| 0.6194444444444425 | 733.297 |
| 0.6201388888888869 | 731.945 |
| 0.6208333333333313 | 730.581 |
| 0.6215277777777758 | 729.205 |
| 0.6222222222222202 | 727.817 |
| 0.6229166666666647 | 726.418 |
| 0.6236111111111091 | 725.006 |
| 0.6243055555555536 | 723.583 |
| 0.624999999999998 | 722.149 |
| 0.6256944444444424 | 720.702 |
| 0.6263888888888869 | 719.244 |
| 0.6270833333333313 | 717.775 |
| 0.6277777777777758 | 716.294 |
| 0.6284722222222202 | 714.801 |
| 0.6291666666666647 | 713.297 |
| 0.6298611111111091 | 711.782 |
| 0.6305555555555535 | 710.255 |
| 0.631249999999998 | 708.717 |
| 0.6319444444444424 | 707.167 |
| 0.6326388888888869 | 705.607 |
| 0.6333333333333313 | 704.035 |
| 0.6340277777777757 | 702.452 |
| 0.6347222222222202 | 700.857 |
| 0.6354166666666646 | 699.252 |
| 0.6361111111111091 | 697.636 |
| 0.6368055555555535 | 696.008 |
| 0.637499999999998 | 694.37 |
| 0.6381944444444424 | 692.721 |
| 0.6388888888888868 | 691.061 |
| 0.6395833333333313 | 689.39 |
| 0.6402777777777757 | 687.708 |
| 0.6409722222222202 | 686.015 |
| 0.6416666666666646 | 684.312 |
| 0.642361111111109 | 682.598 |
| 0.6430555555555535 | 680.874 |
| 0.6437499999999979 | 679.139 |
| 0.6444444444444424 | 677.393 |
| 0.6451388888888868 | 675.638 |
| 0.6458333333333313 | 673.871 |
| 0.6465277777777757 | 672.094 |
| 0.6472222222222201 | 670.307 |
| 0.6479166666666646 | 668.51 |
| 0.648611111111109 | 666.702 |
| 0.6493055555555535 | 664.884 |
| 0.6499999999999979 | 663.057 |
| 0.6506944444444424 | 661.219 |
| 0.6513888888888868 | 659.37 |
| 0.6520833333333312 | 657.512 |
| 0.6527777777777757 | 655.645 |
| 0.6534722222222201 | 653.767 |
| 0.6541666666666646 | 651.879 |
| 0.654861111111109 | 649.982 |
| 0.6555555555555534 | 648.074 |
| 0.6562499999999979 | 646.158 |
| 0.6569444444444423 | 644.231 |
| 0.6576388888888868 | 642.295 |
| 0.6583333333333312 | 640.349 |
| 0.6590277777777757 | 638.394 |
| 0.6597222222222201 | 636.43 |
| 0.6604166666666645 | 634.456 |
| 0.661111111111109 | 632.473 |
| 0.6618055555555534 | 630.481 |
| 0.6624999999999979 | 628.479 |
| 0.6631944444444423 | 626.469 |
| 0.6638888888888868 | 624.449 |
| 0.6645833333333312 | 622.42 |
| 0.6652777777777756 | 620.383 |
| 0.6659722222222201 | 618.336 |
| 0.6666666666666645 | 616.281 |
| 0.667361111111109 | 614.216 |
| 0.6680555555555534 | 612.143 |
| 0.6687499999999978 | 610.062 |
| 0.6694444444444423 | 607.971 |
| 0.6701388888888867 | 605.873 |
| 0.6708333333333312 | 603.765 |
| 0.6715277777777756 | 601.65 |
| 0.6722222222222201 | 599.525 |
| 0.6729166666666645 | 597.393 |
| 0.6736111111111089 | 595.252 |
| 0.6743055555555534 | 593.103 |
| 0.6749999999999978 | 590.946 |
| 0.6756944444444423 | 588.781 |
| 0.6763888888888867 | 586.608 |
| 0.6770833333333311 | 584.427 |
| 0.6777777777777756 | 582.239 |
| 0.67847222222222 | 580.042 |
| 0.6791666666666645 | 577.837 |
| 0.6798611111111089 | 575.625 |
| 0.6805555555555534 | 573.406 |
| 0.6812499999999978 | 571.178 |
| 0.6819444444444422 | 568.943 |
| 0.6826388888888867 | 566.701 |
| 0.6833333333333311 | 564.452 |
| 0.6840277777777756 | 562.195 |
| 0.68472222222222 | 559.931 |
| 0.6854166666666645 | 557.66 |
| 0.6861111111111089 | 555.381 |
| 0.6868055555555533 | 553.096 |
| 0.6874999999999978 | 550.804 |
| 0.6881944444444422 | 548.505 |
| 0.6888888888888867 | 546.199 |
| 0.6895833333333311 | 543.886 |
| 0.6902777777777755 | 541.567 |
| 0.69097222222222 | 539.241 |
| 0.6916666666666644 | 536.909 |
| 0.6923611111111089 | 534.57 |
| 0.6930555555555533 | 532.225 |
| 0.6937499999999978 | 529.873 |
| 0.6944444444444422 | 527.515 |
| 0.6951388888888866 | 525.151 |
| 0.6958333333333311 | 522.781 |
| 0.6965277777777755 | 520.405 |
| 0.69722222222222 | 518.023 |
| 0.6979166666666644 | 515.636 |
| 0.6986111111111089 | 513.242 |
| 0.6993055555555533 | 510.843 |
| 0.6999999999999977 | 508.438 |
| 0.7006944444444422 | 506.027 |
| 0.7013888888888866 | 503.612 |
| 0.7020833333333311 | 501.19 |
| 0.7027777777777755 | 498.764 |
| 0.70347222222222 | 496.332 |
| 0.7041666666666644 | 493.895 |
| 0.7048611111111088 | 491.452 |
| 0.7055555555555533 | 489.005 |
| 0.7062499999999977 | 486.553 |
| 0.7069444444444422 | 484.096 |
| 0.7076388888888866 | 481.635 |
| 0.708333333333331 | 479.169 |
| 0.7090277777777755 | 476.698 |
| 0.7097222222222199 | 474.222 |
| 0.7104166666666644 | 471.742 |
| 0.7111111111111088 | 469.258 |
| 0.7118055555555532 | 466.77 |
| 0.7124999999999977 | 464.277 |
| 0.7131944444444421 | 461.781 |
| 0.7138888888888866 | 459.28 |
| 0.714583333333331 | 456.775 |
| 0.7152777777777755 | 454.267 |
| 0.7159722222222199 | 451.755 |
| 0.7166666666666643 | 449.239 |
| 0.7173611111111088 | 446.72 |
| 0.7180555555555532 | 444.197 |
| 0.7187499999999977 | 441.671 |
| 0.7194444444444421 | 439.141 |
| 0.7201388888888866 | 436.608 |
| 0.720833333333331 | 434.073 |
| 0.7215277777777754 | 431.534 |
| 0.7222222222222199 | 428.992 |
| 0.7229166666666643 | 426.447 |
| 0.7236111111111088 | 423.9 |
| 0.7243055555555532 | 421.35 |
| 0.7249999999999976 | 418.797 |
| 0.7256944444444421 | 416.242 |
| 0.7263888888888865 | 413.685 |
| 0.727083333333331 | 411.125 |
| 0.7277777777777754 | 408.564 |
| 0.7284722222222199 | 406 |
| 0.7291666666666643 | 403.434 |
| 0.7298611111111087 | 400.866 |
| 0.7305555555555532 | 398.297 |
| 0.7312499999999976 | 395.725 |
| 0.7319444444444421 | 393.153 |
| 0.7326388888888865 | 390.578 |
| 0.733333333333331 | 388.003 |
| 0.7340277777777754 | 385.426 |
| 0.7347222222222198 | 382.848 |
| 0.7354166666666643 | 380.269 |
| 0.7361111111111087 | 377.688 |
| 0.7368055555555532 | 375.107 |
| 0.7374999999999976 | 372.526 |
| 0.738194444444442 | 369.943 |
| 0.7388888888888865 | 367.36 |
| 0.7395833333333309 | 364.777 |
| 0.7402777777777754 | 362.193 |
| 0.7409722222222198 | 359.609 |
| 0.7416666666666643 | 357.025 |
| 0.7423611111111087 | 354.441 |
| 0.7430555555555531 | 351.857 |
| 0.7437499999999976 | 349.273 |
| 0.744444444444442 | 346.69 |
| 0.7451388888888865 | 344.107 |
| 0.7458333333333309 | 341.525 |
| 0.7465277777777753 | 338.943 |
| 0.7472222222222198 | 336.362 |
| 0.7479166666666642 | 333.782 |
| 0.7486111111111087 | 331.203 |
| 0.7493055555555531 | 328.625 |
| 0.7499999999999976 | 326.048 |
| 0.750694444444442 | 323.473 |
| 0.7513888888888864 | 320.899 |
| 0.7520833333333309 | 318.327 |
| 0.7527777777777753 | 315.756 |
| 0.7534722222222198 | 313.187 |
| 0.7541666666666642 | 310.621 |
| 0.7548611111111087 | 308.056 |
| 0.7555555555555531 | 305.493 |
| 0.7562499999999975 | 302.933 |
| 0.756944444444442 | 300.376 |
| 0.7576388888888864 | 297.821 |
| 0.7583333333333309 | 295.268 |
| 0.7590277777777753 | 292.719 |
| 0.7597222222222197 | 290.172 |
| 0.7604166666666642 | 287.629 |
| 0.7611111111111086 | 285.088 |
| 0.7618055555555531 | 282.551 |
| 0.7624999999999975 | 280.018 |
| 0.763194444444442 | 277.488 |
| 0.7638888888888864 | 274.962 |
| 0.7645833333333308 | 272.44 |
| 0.7652777777777753 | 269.922 |
| 0.7659722222222197 | 267.408 |
| 0.7666666666666642 | 264.898 |
| 0.7673611111111086 | 262.393 |
| 0.768055555555553 | 259.892 |
| 0.7687499999999975 | 257.396 |
| 0.7694444444444419 | 254.904 |
| 0.7701388888888864 | 252.418 |
| 0.7708333333333308 | 249.937 |
| 0.7715277777777753 | 247.461 |
| 0.7722222222222197 | 244.991 |
| 0.7729166666666641 | 242.526 |
| 0.7736111111111086 | 240.067 |
| 0.774305555555553 | 237.613 |
| 0.7749999999999975 | 235.166 |
| 0.7756944444444419 | 232.725 |
| 0.7763888888888864 | 230.29 |
| 0.7770833333333308 | 227.861 |
| 0.7777777777777752 | 225.439 |
| 0.7784722222222197 | 223.024 |
| 0.7791666666666641 | 220.616 |
| 0.7798611111111086 | 218.214 |
| 0.780555555555553 | 215.82 |
| 0.7812499999999974 | 213.433 |
| 0.7819444444444419 | 211.054 |
| 0.7826388888888863 | 208.682 |
| 0.7833333333333308 | 206.318 |
| 0.7840277777777752 | 203.963 |
| 0.7847222222222197 | 201.615 |
| 0.7854166666666641 | 199.275 |
| 0.7861111111111085 | 196.944 |
| 0.786805555555553 | 194.622 |
| 0.7874999999999974 | 192.308 |
| 0.7881944444444419 | 190.004 |
| 0.7888888888888863 | 187.708 |
| 0.7895833333333308 | 185.422 |
| 0.7902777777777752 | 183.145 |
| 0.7909722222222196 | 180.877 |
| 0.7916666666666641 | 178.619 |
| 0.7923611111111085 | 176.372 |
| 0.793055555555553 | 174.134 |
| 0.7937499999999974 | 171.907 |
| 0.7944444444444418 | 169.69 |
| 0.7951388888888863 | 167.483 |
| 0.7958333333333307 | 165.287 |
| 0.7965277777777752 | 163.103 |
| 0.7972222222222196 | 160.929 |
| 0.797916666666664 | 158.766 |
| 0.7986111111111085 | 156.615 |
| 0.7993055555555529 | 154.476 |
| 0.7999999999999974 | 152.348 |
| 0.8006944444444418 | 150.232 |
| 0.8013888888888863 | 148.128 |
| 0.8020833333333307 | 146.037 |
| 0.8027777777777751 | 143.958 |
| 0.8034722222222196 | 141.892 |
| 0.804166666666664 | 139.838 |
| 0.8048611111111085 | 137.797 |
| 0.8055555555555529 | 135.77 |
| 0.8062499999999974 | 133.755 |
| 0.8069444444444418 | 131.754 |
| 0.8076388888888862 | 129.767 |
| 0.8083333333333307 | 127.793 |
| 0.8090277777777751 | 125.834 |
| 0.8097222222222196 | 123.888 |
| 0.810416666666664 | 121.957 |
| 0.8111111111111085 | 120.04 |
| 0.8118055555555529 | 118.137 |
| 0.8124999999999973 | 116.249 |
| 0.8131944444444418 | 114.377 |
| 0.8138888888888862 | 112.519 |
| 0.8145833333333307 | 110.676 |
| 0.8152777777777751 | 108.849 |
| 0.8159722222222195 | 107.037 |
| 0.816666666666664 | 105.241 |
| 0.8173611111111084 | 103.46 |
| 0.8180555555555529 | 101.695 |
| 0.8187499999999973 | 99.946 |
| 0.8194444444444418 | 98.214 |
| 0.8201388888888862 | 96.497 |
| 0.8208333333333306 | 94.797 |
| 0.8215277777777751 | 93.114 |
| 0.8222222222222195 | 91.446 |
| 0.822916666666664 | 89.796 |
| 0.8236111111111084 | 88.162 |
| 0.8243055555555528 | 86.546 |
| 0.8249999999999973 | 84.946 |
| 0.8256944444444417 | 83.363 |
| 0.8263888888888862 | 81.797 |
| 0.8270833333333306 | 80.248 |
| 0.8277777777777751 | 78.717 |
| 0.8284722222222195 | 77.203 |
| 0.8291666666666639 | 75.706 |
| 0.8298611111111084 | 74.226 |
| 0.8305555555555528 | 72.764 |
| 0.8312499999999973 | 71.319 |
| 0.8319444444444417 | 69.891 |
| 0.8326388888888862 | 68.48 |
| 0.8333333333333306 | 67.087 |
| 0.834027777777775 | 65.711 |
| 0.8347222222222195 | 64.352 |
| 0.8354166666666639 | 63.011 |
| 0.8361111111111084 | 61.686 |
| 0.8368055555555528 | 60.378 |
| 0.8374999999999972 | 59.087 |
| 0.8381944444444417 | 57.813 |
| 0.8388888888888861 | 56.556 |
| 0.8395833333333306 | 55.314 |
| 0.840277777777775 | 54.089 |
| 0.8409722222222195 | 52.881 |
| 0.8416666666666639 | 51.688 |
| 0.8423611111111083 | 50.51 |
| 0.8430555555555528 | 49.348 |
| 0.8437499999999972 | 48.201 |
| 0.8444444444444417 | 47.069 |
| 0.8451388888888861 | 45.952 |
| 0.8458333333333306 | 44.849 |
| 0.846527777777775 | 43.76 |
| 0.8472222222222194 | 42.684 |
| 0.8479166666666639 | 41.622 |
| 0.8486111111111083 | 40.572 |
| 0.8493055555555528 | 39.535 |
| 0.8499999999999972 | 38.511 |
| 0.8506944444444416 | 37.497 |
| 0.8513888888888861 | 36.495 |
| 0.8520833333333305 | 35.504 |
| 0.852777777777775 | 34.524 |
| 0.8534722222222194 | 33.553 |
| 0.8541666666666639 | 32.591 |
| 0.8548611111111083 | 31.639 |
| 0.8555555555555527 | 30.695 |
| 0.8562499999999972 | 29.759 |
| 0.8569444444444416 | 28.83 |
| 0.8576388888888861 | 27.909 |
| 0.8583333333333305 | 26.994 |
| 0.859027777777775 | 26.086 |
| 0.8597222222222194 | 25.183 |
| 0.8604166666666638 | 24.286 |
| 0.8611111111111083 | 23.393 |
| 0.8618055555555527 | 22.505 |
| 0.8624999999999972 | 21.621 |
| 0.8631944444444416 | 20.742 |
| 0.863888888888886 | 19.865 |
| 0.8645833333333305 | 18.992 |
| 0.8652777777777749 | 18.123 |
| 0.8659722222222194 | 17.256 |
| 0.8666666666666638 | 16.391 |
| 0.8673611111111083 | 15.529 |
| 0.8680555555555527 | 14.67 |
| 0.8687499999999971 | 13.812 |
| 0.8694444444444416 | 12.957 |
| 0.870138888888886 | 12.104 |
| 0.8708333333333305 | 11.253 |
| 0.8715277777777749 | 10.403 |
| 0.8722222222222193 | 9.556 |
| 0.8729166666666638 | 8.711 |
| 0.8736111111111082 | 7.867 |
| 0.8743055555555527 | 7.026 |
| 0.8749999999999971 | 6.186 |
| 0.8756944444444416 | 5.348 |
| 0.876388888888886 | 4.513 |
| 0.8770833333333304 | 3.679 |
| 0.8777777777777749 | 2.847 |
| 0.8784722222222193 | 2.017 |
| 0.8791666666666638 | 1.189 |
| 0.8798611111111082 | 0.363 |
| 0.8805555555555526 | 0 |
| 0.8812499999999971 | 0 |
| 0.8819444444444415 | 0 |
| 0.882638888888886 | 0 |
| 0.8833333333333304 | 0 |
| 0.8840277777777749 | 0 |
| 0.8847222222222193 | 0 |
| 0.8854166666666637 | 0 |
| 0.8861111111111082 | 0 |
| 0.8868055555555526 | 0 |
| 0.8874999999999971 | 0 |
| 0.8881944444444415 | 0 |
| 0.888888888888886 | 0 |
| 0.8895833333333304 | 0 |
| 0.8902777777777748 | 0 |
| 0.8909722222222193 | 0 |
| 0.8916666666666637 | 0 |
| 0.8923611111111082 | 0 |
| 0.8930555555555526 | 0 |
| 0.893749999999997 | 0 |
| 0.8944444444444415 | 0 |
| 0.8951388888888859 | 0 |
| 0.8958333333333304 | 0 |
| 0.8965277777777748 | 0 |
| 0.8972222222222193 | 0 |
| 0.8979166666666637 | 0 |
| 0.8986111111111081 | 0 |
| 0.8993055555555526 | 0 |
| 0.899999999999997 | 0 |
| 0.9006944444444415 | 0 |
| 0.9013888888888859 | 0 |
| 0.9020833333333304 | 0 |
| 0.9027777777777748 | 0 |
| 0.9034722222222192 | 0 |
| 0.9041666666666637 | 0 |
| 0.9048611111111081 | 0 |
| 0.9055555555555526 | 0 |
| 0.906249999999997 | 0 |
| 0.9069444444444414 | 0 |
| 0.9076388888888859 | 0 |
| 0.9083333333333303 | 0 |
| 0.9090277777777748 | 0 |
| 0.9097222222222192 | 0 |
| 0.9104166666666637 | 0 |
| 0.9111111111111081 | 0 |
| 0.9118055555555525 | 0 |
| 0.912499999999997 | 0 |
| 0.9131944444444414 | 0 |
| 0.9138888888888859 | 0 |
| 0.9145833333333303 | 0 |
| 0.9152777777777747 | 0 |
| 0.9159722222222192 | 0 |
| 0.9166666666666636 | 0 |
| 0.9173611111111081 | 0 |
| 0.9180555555555525 | 0 |
| 0.918749999999997 | 0 |
| 0.9194444444444414 | 0 |
| 0.9201388888888858 | 0 |
| 0.9208333333333303 | 0 |
| 0.9215277777777747 | 0 |
| 0.9222222222222192 | 0 |
| 0.9229166666666636 | 0 |
| 0.923611111111108 | 0 |
| 0.9243055555555525 | 0 |
| 0.9249999999999969 | 0 |
| 0.9256944444444414 | 0 |
| 0.9263888888888858 | 0 |
| 0.9270833333333303 | 0 |
| 0.9277777777777747 | 0 |
| 0.9284722222222191 | 0 |
| 0.9291666666666636 | 0 |
| 0.929861111111108 | 0 |
| 0.9305555555555525 | 0 |
| 0.9312499999999969 | 0 |
| 0.9319444444444414 | 0 |
| 0.9326388888888858 | 0 |
| 0.9333333333333302 | 0 |
| 0.9340277777777747 | 0 |
| 0.9347222222222191 | 0 |
| 0.9354166666666636 | 0 |
| 0.936111111111108 | 0 |
| 0.9368055555555524 | 0 |
| 0.9374999999999969 | 0 |
| 0.9381944444444413 | 0 |
| 0.9388888888888858 | 0 |
| 0.9395833333333302 | 0 |
| 0.9402777777777747 | 0 |
| 0.9409722222222191 | 0 |
| 0.9416666666666635 | 0 |
| 0.942361111111108 | 0 |
| 0.9430555555555524 | 0 |
| 0.9437499999999969 | 0 |
| 0.9444444444444413 | 0 |
| 0.9451388888888858 | 0 |
| 0.9458333333333302 | 0 |
| 0.9465277777777746 | 0 |
| 0.9472222222222191 | 0 |
| 0.9479166666666635 | 0 |
| 0.948611111111108 | 0 |
| 0.9493055555555524 | 0 |
| 0.9499999999999968 | 0 |
| 0.9506944444444413 | 0 |
| 0.9513888888888857 | 0 |
| 0.9520833333333302 | 0 |
| 0.9527777777777746 | 0 |
| 0.9534722222222191 | 0 |
| 0.9541666666666635 | 0 |
| 0.9548611111111079 | 0 |
| 0.9555555555555524 | 0 |
| 0.9562499999999968 | 0 |
| 0.9569444444444413 | 0 |
| 0.9576388888888857 | 0 |
| 0.9583333333333302 | 0 |
| 0.9590277777777746 | 0 |
| 0.959722222222219 | 0 |
| 0.9604166666666635 | 0 |
| 0.9611111111111079 | 0 |
| 0.9618055555555524 | 0 |
| 0.9624999999999968 | 0 |
| 0.9631944444444412 | 0 |
| 0.9638888888888857 | 0 |
| 0.9645833333333301 | 0 |
| 0.9652777777777746 | 0 |
| 0.965972222222219 | 0 |
| 0.9666666666666635 | 0 |
| 0.9673611111111079 | 0 |
| 0.9680555555555523 | 0 |
| 0.9687499999999968 | 0 |
| 0.9694444444444412 | 0 |
| 0.9701388888888857 | 0 |
| 0.9708333333333301 | 0 |
| 0.9715277777777745 | 0 |
| 0.972222222222219 | 0 |
| 0.9729166666666634 | 0 |
| 0.9736111111111079 | 0 |
| 0.9743055555555523 | 0 |
| 0.9749999999999968 | 0 |
| 0.9756944444444412 | 0 |
| 0.9763888888888856 | 0 |
| 0.9770833333333301 | 0 |
| 0.9777777777777745 | 0 |
| 0.978472222222219 | 0 |
| 0.9791666666666634 | 0 |
| 0.9798611111111079 | 0 |
| 0.9805555555555523 | 0 |
| 0.9812499999999967 | 0 |
| 0.9819444444444412 | 0 |
| 0.9826388888888856 | 0 |
| 0.9833333333333301 | 0 |
| 0.9840277777777745 | 0 |
| 0.984722222222219 | 0 |
| 0.9854166666666634 | 0 |
| 0.9861111111111078 | 0 |
| 0.9868055555555523 | 0 |
| 0.9874999999999967 | 0 |
| 0.9881944444444412 | 0 |
| 0.9888888888888856 | 0 |
| 0.98958333333333 | 0 |
| 0.9902777777777745 | 0 |
| 0.9909722222222189 | 0 |
| 0.9916666666666634 | 0 |
| 0.9923611111111078 | 0 |
| 0.9930555555555522 | 0 |
| 0.9937499999999967 | 0 |
| 0.9944444444444411 | 0 |
| 0.9951388888888856 | 0 |
| 0.99583333333333 | 0 |
| 0.9965277777777745 | 0 |
| 0.9972222222222189 | 0 |
| 0.9979166666666633 | 0 |
| 0.9986111111111078 | 0 |
| 0.9993055555555522 | 0 |